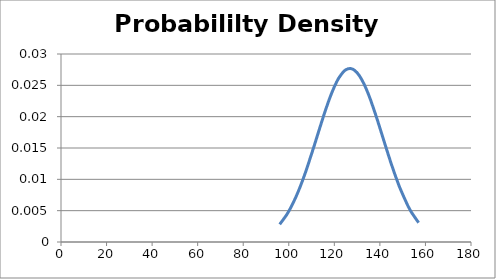
| Category | f(x) |
|---|---|
| 96.0 | 0.003 |
| 99.0 | 0.004 |
| 101.0 | 0.006 |
| 103.0 | 0.007 |
| 103.0 | 0.007 |
| 104.0 | 0.008 |
| 104.0 | 0.008 |
| 104.0 | 0.008 |
| 105.0 | 0.009 |
| 106.0 | 0.01 |
| 106.0 | 0.01 |
| 106.0 | 0.01 |
| 106.0 | 0.01 |
| 107.0 | 0.011 |
| 107.0 | 0.011 |
| 108.0 | 0.012 |
| 111.0 | 0.015 |
| 112.0 | 0.016 |
| 112.0 | 0.016 |
| 113.0 | 0.018 |
| 113.0 | 0.018 |
| 114.0 | 0.019 |
| 114.0 | 0.019 |
| 115.0 | 0.02 |
| 116.0 | 0.021 |
| 116.0 | 0.021 |
| 117.0 | 0.022 |
| 117.0 | 0.022 |
| 117.0 | 0.022 |
| 118.0 | 0.023 |
| 119.0 | 0.024 |
| 119.0 | 0.024 |
| 120.0 | 0.025 |
| 120.0 | 0.025 |
| 120.0 | 0.025 |
| 121.0 | 0.026 |
| 121.0 | 0.026 |
| 121.0 | 0.026 |
| 122.0 | 0.026 |
| 124.0 | 0.027 |
| 125.0 | 0.027 |
| 125.0 | 0.027 |
| 126.0 | 0.028 |
| 126.0 | 0.028 |
| 126.0 | 0.028 |
| 126.0 | 0.028 |
| 127.0 | 0.028 |
| 127.0 | 0.028 |
| 128.0 | 0.028 |
| 129.0 | 0.027 |
| 129.0 | 0.027 |
| 130.0 | 0.027 |
| 130.0 | 0.027 |
| 130.0 | 0.027 |
| 130.0 | 0.027 |
| 130.0 | 0.027 |
| 130.0 | 0.027 |
| 131.0 | 0.027 |
| 131.0 | 0.027 |
| 132.0 | 0.026 |
| 132.0 | 0.026 |
| 132.0 | 0.026 |
| 133.0 | 0.025 |
| 133.0 | 0.025 |
| 133.0 | 0.025 |
| 133.0 | 0.025 |
| 134.0 | 0.024 |
| 134.0 | 0.024 |
| 134.0 | 0.024 |
| 135.0 | 0.024 |
| 136.0 | 0.023 |
| 136.0 | 0.023 |
| 136.0 | 0.023 |
| 136.0 | 0.023 |
| 138.0 | 0.02 |
| 138.0 | 0.02 |
| 138.0 | 0.02 |
| 139.0 | 0.019 |
| 140.0 | 0.018 |
| 140.0 | 0.018 |
| 140.0 | 0.018 |
| 141.0 | 0.017 |
| 141.0 | 0.017 |
| 141.0 | 0.017 |
| 141.0 | 0.017 |
| 142.0 | 0.016 |
| 142.0 | 0.016 |
| 144.0 | 0.014 |
| 145.0 | 0.012 |
| 146.0 | 0.011 |
| 147.0 | 0.01 |
| 147.0 | 0.01 |
| 147.0 | 0.01 |
| 148.0 | 0.009 |
| 148.0 | 0.009 |
| 149.0 | 0.008 |
| 152.0 | 0.006 |
| 153.0 | 0.005 |
| 154.0 | 0.005 |
| 157.0 | 0.003 |